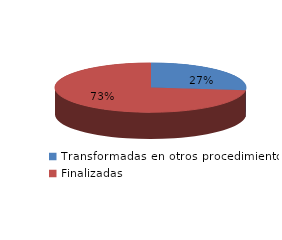
| Category | Series 0 |
|---|---|
| Transformadas en otros procedimientos | 5609 |
| Finalizadas | 15385 |